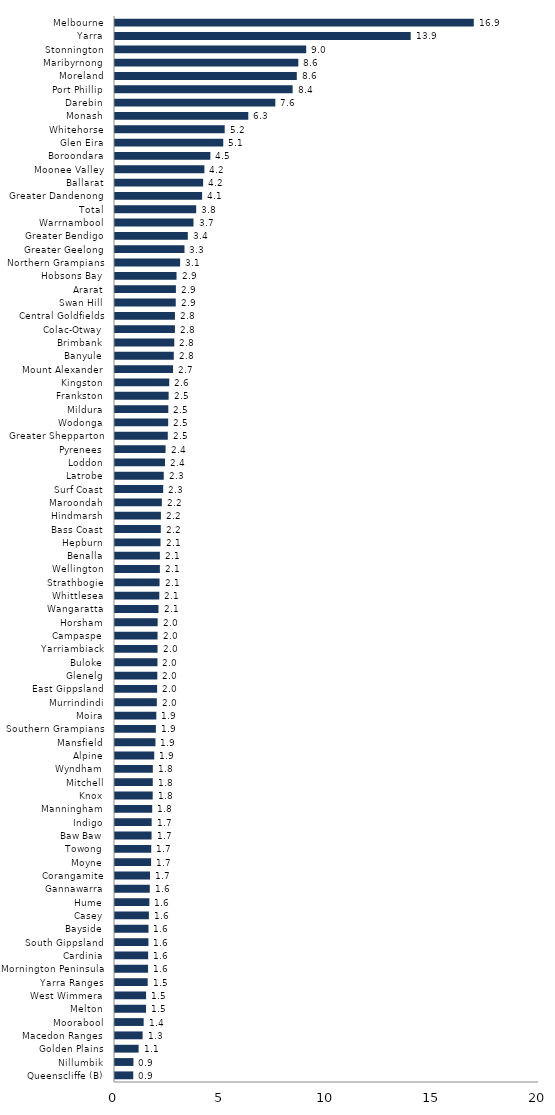
| Category | Series 0 |
|---|---|
| Queenscliffe (B) | 0.861 |
| Nillumbik | 0.871 |
| Golden Plains | 1.114 |
| Macedon Ranges | 1.302 |
| Moorabool | 1.352 |
| Melton | 1.462 |
| West Wimmera | 1.466 |
| Yarra Ranges | 1.542 |
| Mornington Peninsula | 1.559 |
| Cardinia | 1.563 |
| South Gippsland | 1.577 |
| Bayside | 1.58 |
| Casey | 1.599 |
| Hume | 1.622 |
| Gannawarra | 1.642 |
| Corangamite | 1.651 |
| Moyne | 1.703 |
| Towong | 1.709 |
| Baw Baw | 1.725 |
| Indigo | 1.729 |
| Manningham | 1.755 |
| Knox | 1.778 |
| Mitchell | 1.782 |
| Wyndham | 1.784 |
| Alpine | 1.851 |
| Mansfield | 1.908 |
| Southern Grampians | 1.929 |
| Moira | 1.948 |
| Murrindindi | 1.973 |
| East Gippsland | 1.987 |
| Glenelg | 1.996 |
| Buloke | 2.004 |
| Yarriambiack | 2.006 |
| Campaspe | 2.008 |
| Horsham | 2.012 |
| Wangaratta | 2.052 |
| Whittlesea | 2.09 |
| Strathbogie | 2.102 |
| Wellington | 2.117 |
| Benalla | 2.117 |
| Hepburn | 2.147 |
| Bass Coast | 2.161 |
| Hindmarsh | 2.166 |
| Maroondah | 2.209 |
| Surf Coast | 2.273 |
| Latrobe | 2.3 |
| Loddon | 2.359 |
| Pyrenees | 2.386 |
| Greater Shepparton | 2.49 |
| Wodonga | 2.508 |
| Mildura | 2.515 |
| Frankston | 2.53 |
| Kingston | 2.559 |
| Mount Alexander | 2.738 |
| Banyule | 2.774 |
| Brimbank | 2.797 |
| Colac-Otway | 2.827 |
| Central Goldfields | 2.828 |
| Swan Hill | 2.865 |
| Ararat | 2.873 |
| Hobsons Bay | 2.902 |
| Northern Grampians | 3.072 |
| Greater Geelong | 3.277 |
| Greater Bendigo | 3.434 |
| Warrnambool | 3.703 |
| Total | 3.83 |
| Greater Dandenong | 4.109 |
| Ballarat | 4.157 |
| Moonee Valley | 4.218 |
| Boroondara | 4.499 |
| Glen Eira | 5.106 |
| Whitehorse | 5.175 |
| Monash | 6.288 |
| Darebin | 7.562 |
| Port Phillip | 8.379 |
| Moreland | 8.576 |
| Maribyrnong | 8.648 |
| Stonnington | 9.018 |
| Yarra | 13.948 |
| Melbourne | 16.924 |